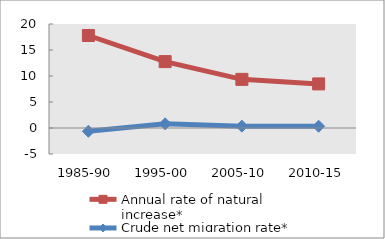
| Category | Annual rate of natural increase* | Crude net migration rate* |
|---|---|---|
| 1985-90 | 17.79 | -0.631 |
| 1995-00 | 12.769 | 0.803 |
| 2005-10 | 9.353 | 0.358 |
| 2010-15 | 8.477 | 0.342 |